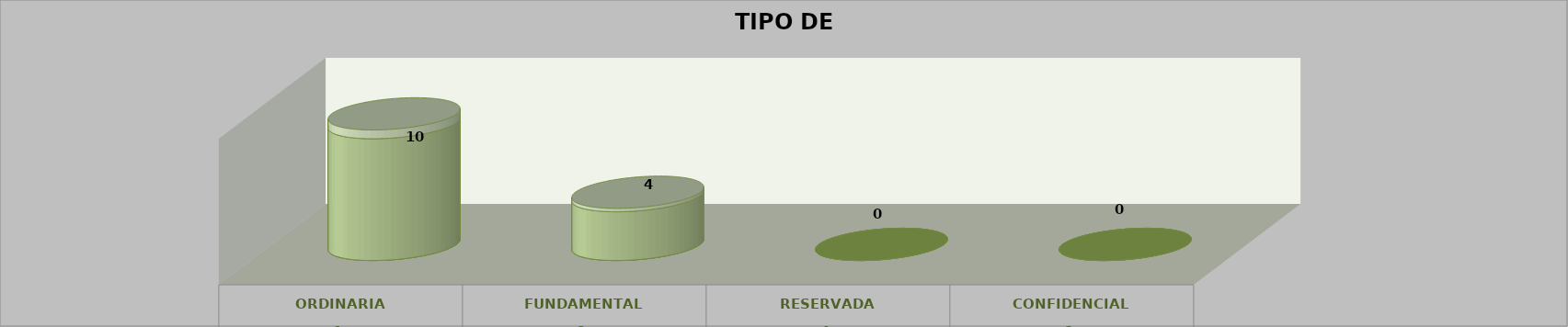
| Category | Series 0 | Series 2 | Series 1 | Series 3 | Series 4 |
|---|---|---|---|---|---|
| 0 |  |  |  | 10 | 0.72 |
| 1 |  |  |  | 4 | 0.28 |
| 2 |  |  |  | 0 | 0 |
| 3 |  |  |  | 0 | 0 |